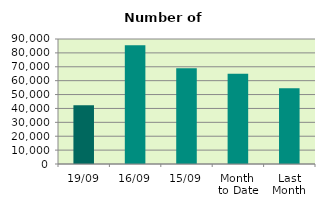
| Category | Series 0 |
|---|---|
| 19/09 | 42348 |
| 16/09 | 85520 |
| 15/09 | 69006 |
| Month 
to Date | 65062.923 |
| Last
Month | 54581.565 |